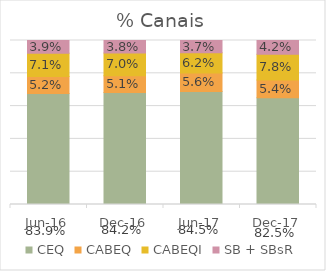
| Category | CEQ | CABEQ | CABEQI | SB + SBsR |
|---|---|---|---|---|
| 2016-06-01 | 0.839 | 0.052 | 0.071 | 0.039 |
| 2016-12-01 | 0.842 | 0.051 | 0.07 | 0.038 |
| 2017-06-01 | 0.845 | 0.056 | 0.062 | 0.037 |
| 2017-12-01 | 0.825 | 0.054 | 0.078 | 0.042 |